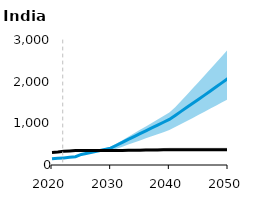
| Category | IND ZCT Ref | IND FOS Ref |
|---|---|---|
| 2020.0 | 148.362 | 302.09 |
| 2021.0 | 159.776 | 310.67 |
| 2022.0 | 170.005 | 327.776 |
| 2023.0 | 183.196 | 338.29 |
| 2024.0 | 198.842 | 346.818 |
| 2025.0 | 253.645 | 346.818 |
| 2026.0 | 283.777 | 346.934 |
| 2027.0 | 313.909 | 347.049 |
| 2028.0 | 344.041 | 347.165 |
| 2029.0 | 374.173 | 347.281 |
| 2030.0 | 404.305 | 347.396 |
| 2031.0 | 473.97 | 349.172 |
| 2032.0 | 543.635 | 350.947 |
| 2033.0 | 613.3 | 352.722 |
| 2034.0 | 682.965 | 354.498 |
| 2035.0 | 752.63 | 356.273 |
| 2036.0 | 820.876 | 358.269 |
| 2037.0 | 889.121 | 360.264 |
| 2038.0 | 957.366 | 362.26 |
| 2039.0 | 1025.612 | 364.256 |
| 2040.0 | 1093.857 | 366.251 |
| 2041.0 | 1190.586 | 366.251 |
| 2042.0 | 1287.315 | 366.251 |
| 2043.0 | 1384.045 | 366.251 |
| 2044.0 | 1480.774 | 366.251 |
| 2045.0 | 1577.503 | 366.251 |
| 2046.0 | 1677.431 | 366.251 |
| 2047.0 | 1777.36 | 366.251 |
| 2048.0 | 1877.289 | 366.251 |
| 2049.0 | 1977.218 | 366.251 |
| 2050.0 | 2077.147 | 366.251 |